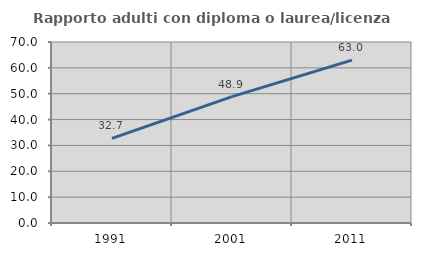
| Category | Rapporto adulti con diploma o laurea/licenza media  |
|---|---|
| 1991.0 | 32.735 |
| 2001.0 | 48.872 |
| 2011.0 | 63.004 |